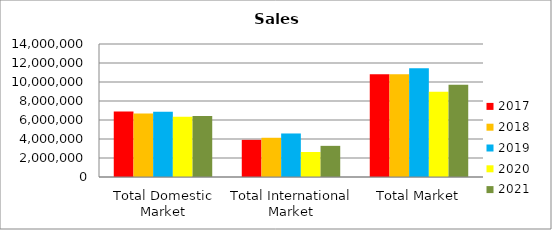
| Category | 2017 | 2018 | 2019 | 2020 | 2021 |
|---|---|---|---|---|---|
| Total Domestic Market | 6899847 | 6685490 | 6874557 | 6339614 | 6421125 |
| Total International Market | 3908204 | 4129016 | 4581854 | 2630986 | 3278796 |
| Total Market | 10808051 | 10814506 | 11456411 | 8970600 | 9699921 |